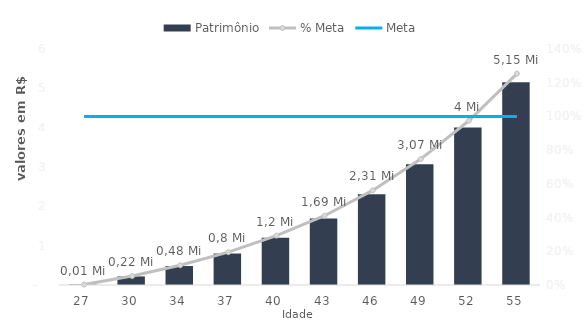
| Category | Patrimônio |
|---|---|
| 27.28219178082192 | 10000 |
| 30.36986301369863 | 218336.594 |
| 33.534246575342465 | 482162.733 |
| 36.62191780821918 | 800197.463 |
| 39.79178082191781 | 1203714.207 |
| 42.87397260273973 | 1688432.988 |
| 46.04657534246575 | 2305010.157 |
| 49.21643835616438 | 3068483.016 |
| 52.35237348752213 | 4003342.967 |
| 55.47123287671233 | 5152187.297 |